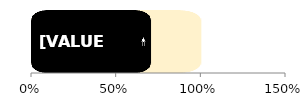
| Category | Total | Male |
|---|---|---|
| 0 | 1 | 0.703 |